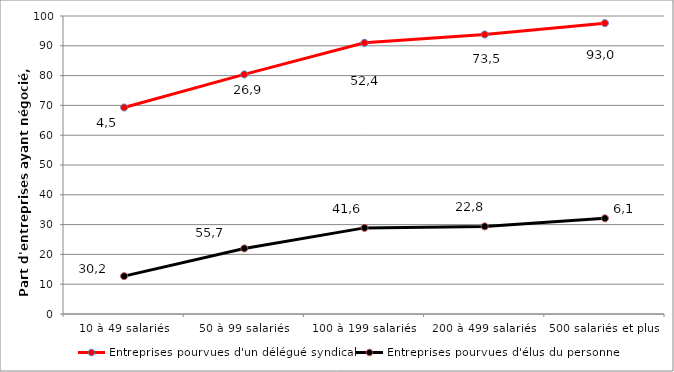
| Category | Entreprises pourvues d'un délégué syndical  | Entreprises pourvues d'élus du personnel  |
|---|---|---|
| 10 à 49 salariés | 69.3 | 12.7 |
| 50 à 99 salariés | 80.4 | 22 |
| 100 à 199 salariés | 91 | 28.9 |
| 200 à 499 salariés | 93.8 | 29.4 |
| 500 salariés et plus | 97.6 | 32.1 |